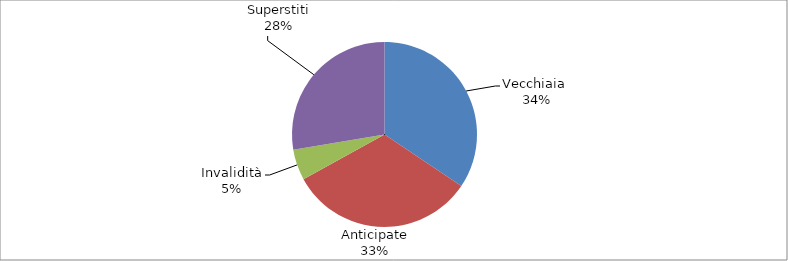
| Category | Series 0 |
|---|---|
| Vecchiaia  | 21099 |
| Anticipate | 19966 |
| Invalidità | 3293 |
| Superstiti | 16946 |